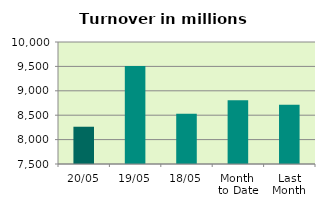
| Category | Series 0 |
|---|---|
| 20/05 | 8263.605 |
| 19/05 | 9507.082 |
| 18/05 | 8529.457 |
| Month 
to Date | 8808.335 |
| Last
Month | 8713.977 |